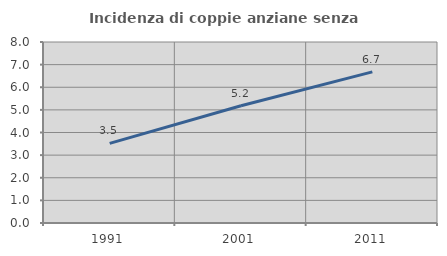
| Category | Incidenza di coppie anziane senza figli  |
|---|---|
| 1991.0 | 3.52 |
| 2001.0 | 5.18 |
| 2011.0 | 6.682 |